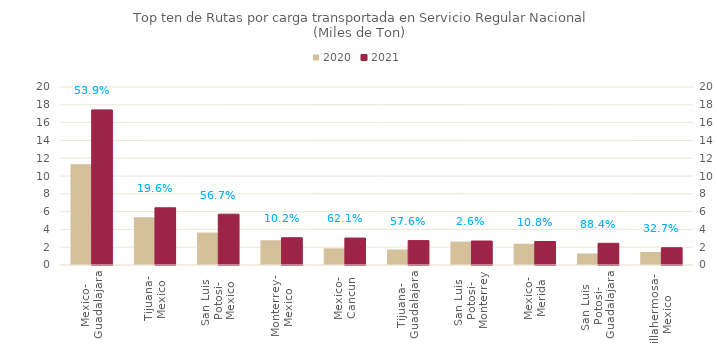
| Category | 2020 | 2021 |
|---|---|---|
| Mexico-
Guadalajara | 11323.025 | 17427.476 |
| Tijuana-
Mexico | 5376.636 | 6428.583 |
| San Luis 
Potosi-
Mexico | 3645.422 | 5711.182 |
| Monterrey-
Mexico | 2781.801 | 3064.555 |
| Mexico-
Cancun | 1869.78 | 3030.563 |
| Tijuana-
Guadalajara | 1740.216 | 2742.554 |
| San Luis 
Potosi-
Monterrey | 2625.68 | 2694.686 |
| Mexico-
Merida | 2383.083 | 2641.198 |
| San Luis 
Potosi-
Guadalajara | 1293.551 | 2436.938 |
| Villahermosa-
Mexico | 1461.186 | 1939.093 |